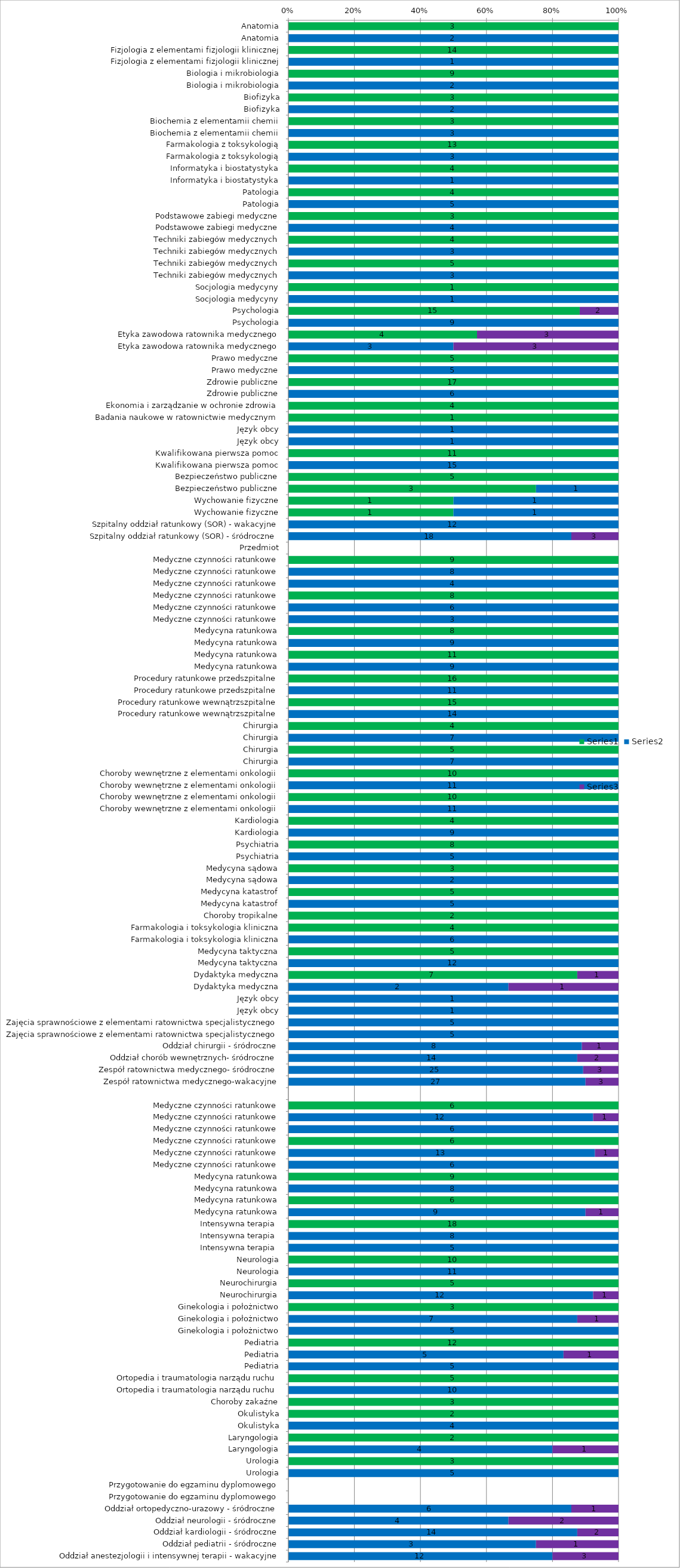
| Category | Series 0 | Series 1 | Series 2 |
|---|---|---|---|
| Anatomia | 3 | 0 | 0 |
| Anatomia | 0 | 2 | 0 |
| Fizjologia z elementami fizjologii klinicznej | 14 | 0 | 0 |
| Fizjologia z elementami fizjologii klinicznej | 0 | 1 | 0 |
| Biologia i mikrobiologia | 9 | 0 | 0 |
| Biologia i mikrobiologia | 0 | 2 | 0 |
| Biofizyka | 3 | 0 | 0 |
| Biofizyka | 0 | 2 | 0 |
| Biochemia z elementamii chemii | 3 | 0 | 0 |
| Biochemia z elementamii chemii | 0 | 3 | 0 |
| Farmakologia z toksykologią | 13 | 0 | 0 |
| Farmakologia z toksykologią | 0 | 3 | 0 |
| Informatyka i biostatystyka | 4 | 0 | 0 |
| Informatyka i biostatystyka | 0 | 1 | 0 |
| Patologia | 4 | 0 | 0 |
| Patologia | 0 | 5 | 0 |
| Podstawowe zabiegi medyczne | 3 | 0 | 0 |
| Podstawowe zabiegi medyczne | 0 | 4 | 0 |
| Techniki zabiegów medycznych | 4 | 0 | 0 |
| Techniki zabiegów medycznych | 0 | 3 | 0 |
| Techniki zabiegów medycznych | 5 | 0 | 0 |
| Techniki zabiegów medycznych | 0 | 3 | 0 |
| Socjologia medycyny | 1 | 0 | 0 |
| Socjologia medycyny | 0 | 1 | 0 |
| Psychologia | 15 | 0 | 2 |
| Psychologia | 0 | 9 | 0 |
| Etyka zawodowa ratownika medycznego | 4 | 0 | 3 |
| Etyka zawodowa ratownika medycznego | 0 | 3 | 3 |
| Prawo medyczne | 5 | 0 | 0 |
| Prawo medyczne | 0 | 5 | 0 |
| Zdrowie publiczne | 17 | 0 | 0 |
| Zdrowie publiczne | 0 | 6 | 0 |
| Ekonomia i zarządzanie w ochronie zdrowia | 4 | 0 | 0 |
| Badania naukowe w ratownictwie medycznym | 1 | 0 | 0 |
| Język obcy | 0 | 1 | 0 |
| Język obcy | 0 | 1 | 0 |
| Kwalifikowana pierwsza pomoc | 11 | 0 | 0 |
| Kwalifikowana pierwsza pomoc | 0 | 15 | 0 |
| Bezpieczeństwo publiczne | 5 | 0 | 0 |
| Bezpieczeństwo publiczne | 3 | 1 | 0 |
| Wychowanie fizyczne | 1 | 1 | 0 |
| Wychowanie fizyczne | 1 | 1 | 0 |
| Szpitalny oddział ratunkowy (SOR) - wakacyjne | 0 | 12 | 0 |
| Szpitalny oddział ratunkowy (SOR) - śródroczne | 0 | 18 | 3 |
| Przedmiot | 0 | 0 | 0 |
| Medyczne czynności ratunkowe | 9 | 0 | 0 |
| Medyczne czynności ratunkowe | 0 | 8 | 0 |
| Medyczne czynności ratunkowe | 0 | 4 | 0 |
| Medyczne czynności ratunkowe | 8 | 0 | 0 |
| Medyczne czynności ratunkowe | 0 | 6 | 0 |
| Medyczne czynności ratunkowe | 0 | 3 | 0 |
| Medycyna ratunkowa | 8 | 0 | 0 |
| Medycyna ratunkowa | 0 | 9 | 0 |
| Medycyna ratunkowa | 11 | 0 | 0 |
| Medycyna ratunkowa | 0 | 9 | 0 |
| Procedury ratunkowe przedszpitalne | 16 | 0 | 0 |
| Procedury ratunkowe przedszpitalne | 0 | 11 | 0 |
| Procedury ratunkowe wewnątrzszpitalne | 15 | 0 | 0 |
| Procedury ratunkowe wewnątrzszpitalne | 0 | 14 | 0 |
| Chirurgia | 4 | 0 | 0 |
| Chirurgia | 0 | 7 | 0 |
| Chirurgia | 5 | 0 | 0 |
| Chirurgia | 0 | 7 | 0 |
| Choroby wewnętrzne z elementami onkologii | 10 | 0 | 0 |
| Choroby wewnętrzne z elementami onkologii | 0 | 11 | 0 |
| Choroby wewnętrzne z elementami onkologii | 10 | 0 | 0 |
| Choroby wewnętrzne z elementami onkologii | 0 | 11 | 0 |
| Kardiologia | 4 | 0 | 0 |
| Kardiologia | 0 | 9 | 0 |
| Psychiatria | 8 | 0 | 0 |
| Psychiatria | 0 | 5 | 0 |
| Medycyna sądowa | 3 | 0 | 0 |
| Medycyna sądowa | 0 | 2 | 0 |
| Medycyna katastrof | 5 | 0 | 0 |
| Medycyna katastrof | 0 | 5 | 0 |
| Choroby tropikalne | 2 | 0 | 0 |
| Farmakologia i toksykologia kliniczna | 4 | 0 | 0 |
| Farmakologia i toksykologia kliniczna | 0 | 6 | 0 |
| Medycyna taktyczna | 5 | 0 | 0 |
| Medycyna taktyczna | 0 | 12 | 0 |
| Dydaktyka medyczna | 7 | 0 | 1 |
| Dydaktyka medyczna | 0 | 2 | 1 |
| Język obcy | 0 | 1 | 0 |
| Język obcy | 0 | 1 | 0 |
| Zajęcia sprawnościowe z elementami ratownictwa specjalistycznego | 0 | 5 | 0 |
| Zajęcia sprawnościowe z elementami ratownictwa specjalistycznego | 0 | 5 | 0 |
| Oddział chirurgii - śródroczne | 0 | 8 | 1 |
| Oddział chorób wewnętrznych- śródroczne | 0 | 14 | 2 |
| Zespół ratownictwa medycznego- śródroczne | 0 | 25 | 3 |
| Zespół ratownictwa medycznego-wakacyjne | 0 | 27 | 3 |
|  | 0 | 0 | 0 |
| Medyczne czynności ratunkowe | 6 | 0 | 0 |
| Medyczne czynności ratunkowe | 0 | 12 | 1 |
| Medyczne czynności ratunkowe | 0 | 6 | 0 |
| Medyczne czynności ratunkowe | 6 | 0 | 0 |
| Medyczne czynności ratunkowe | 0 | 13 | 1 |
| Medyczne czynności ratunkowe | 0 | 6 | 0 |
| Medycyna ratunkowa | 9 | 0 | 0 |
| Medycyna ratunkowa | 0 | 8 | 0 |
| Medycyna ratunkowa | 6 | 0 | 0 |
| Medycyna ratunkowa | 0 | 9 | 1 |
| Intensywna terapia  | 18 | 0 | 0 |
| Intensywna terapia  | 0 | 8 | 0 |
| Intensywna terapia  | 0 | 5 | 0 |
| Neurologia | 10 | 0 | 0 |
| Neurologia | 0 | 11 | 0 |
| Neurochirurgia | 5 | 0 | 0 |
| Neurochirurgia | 0 | 12 | 1 |
| Ginekologia i położnictwo | 3 | 0 | 0 |
| Ginekologia i położnictwo | 0 | 7 | 1 |
| Ginekologia i położnictwo | 0 | 5 | 0 |
| Pediatria | 12 | 0 | 0 |
| Pediatria | 0 | 5 | 1 |
| Pediatria | 0 | 5 | 0 |
| Ortopedia i traumatologia narządu ruchu | 5 | 0 | 0 |
| Ortopedia i traumatologia narządu ruchu | 0 | 10 | 0 |
| Choroby zakaźne | 3 | 0 | 0 |
| Okulistyka | 2 | 0 | 0 |
| Okulistyka | 0 | 4 | 0 |
| Laryngologia | 2 | 0 | 0 |
| Laryngologia | 0 | 4 | 1 |
| Urologia | 3 | 0 | 0 |
| Urologia | 0 | 5 | 0 |
| Przygotowanie do egzaminu dyplomowego | 0 | 0 | 0 |
| Przygotowanie do egzaminu dyplomowego | 0 | 0 | 0 |
| Oddział ortopedyczno-urazowy - śródroczne | 0 | 6 | 1 |
| Oddział neurologii - śródroczne | 0 | 4 | 2 |
| Oddział kardiologii - śródroczne | 0 | 14 | 2 |
| Oddział pediatrii - śródroczne | 0 | 3 | 1 |
| Oddział anestezjologii i intensywnej terapii - wakacyjne | 0 | 12 | 3 |